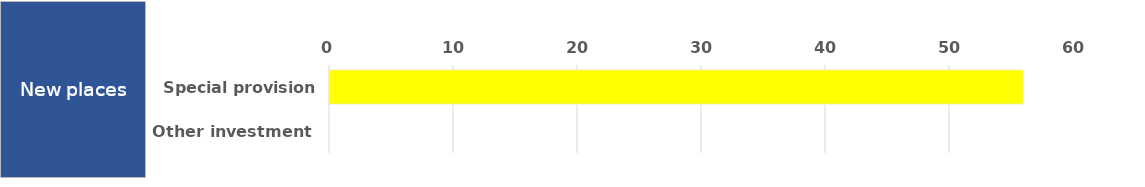
| Category | Alternative provision/PRU | Independent and non-maintained | Mainstream provision (not unit) | Special provision | Special unit or resourced provision | Other |
|---|---|---|---|---|---|---|
| Special provision fund | 0 | 0 | 0 | 0 | 56 | 0 |
| Other investment | 0 | 0 | 0 | 0 | 0 | 0 |